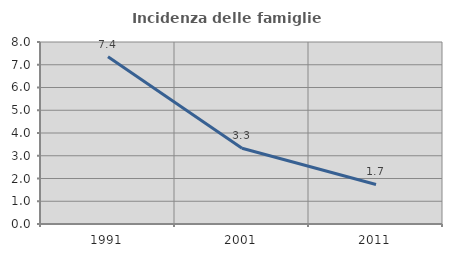
| Category | Incidenza delle famiglie numerose |
|---|---|
| 1991.0 | 7.356 |
| 2001.0 | 3.331 |
| 2011.0 | 1.736 |